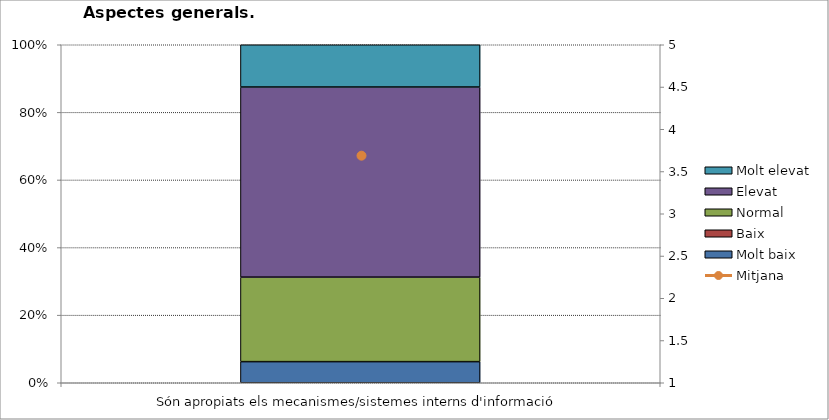
| Category | Molt baix | Baix | Normal  | Elevat | Molt elevat |
|---|---|---|---|---|---|
| Són apropiats els mecanismes/sistemes interns d'informació | 1 | 0 | 4 | 9 | 2 |